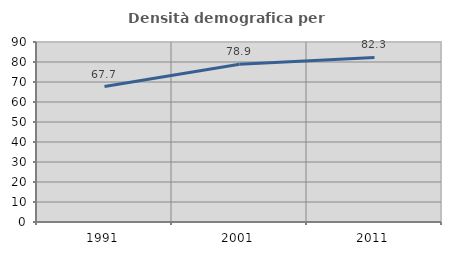
| Category | Densità demografica |
|---|---|
| 1991.0 | 67.731 |
| 2001.0 | 78.877 |
| 2011.0 | 82.306 |